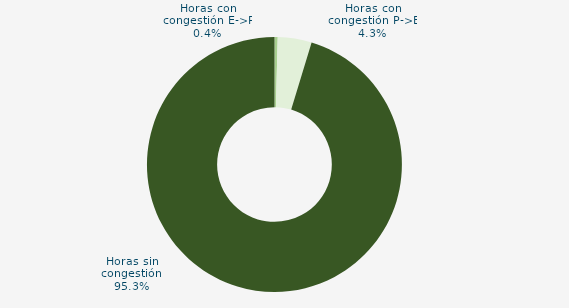
| Category | Horas con congestión E->P |
|---|---|
| Horas con congestión E->P | 0.403 |
| Horas con congestión P->E | 4.295 |
| Horas sin congestión | 95.302 |